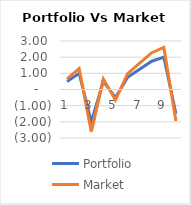
| Category | Portfolio | Market |
|---|---|---|
| 0 | 0.5 | 0.65 |
| 1 | 1 | 1.3 |
| 2 | -2 | -2.6 |
| 3 | 0.5 | 0.65 |
| 4 | -0.5 | -0.65 |
| 5 | 0.75 | 0.975 |
| 6 | 1.25 | 1.625 |
| 7 | 1.75 | 2.275 |
| 8 | 2 | 2.6 |
| 9 | -1.5 | -1.95 |